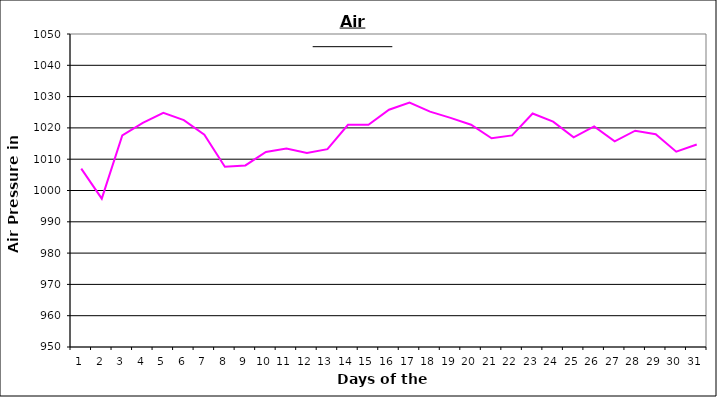
| Category | Series 0 |
|---|---|
| 0 | 1007 |
| 1 | 997.4 |
| 2 | 1017.6 |
| 3 | 1021.6 |
| 4 | 1024.8 |
| 5 | 1022.5 |
| 6 | 1017.8 |
| 7 | 1007.6 |
| 8 | 1008 |
| 9 | 1012.3 |
| 10 | 1013.4 |
| 11 | 1012 |
| 12 | 1013.2 |
| 13 | 1021 |
| 14 | 1021 |
| 15 | 1025.8 |
| 16 | 1028.1 |
| 17 | 1025.2 |
| 18 | 1023.2 |
| 19 | 1021 |
| 20 | 1016.7 |
| 21 | 1017.6 |
| 22 | 1024.6 |
| 23 | 1022 |
| 24 | 1017 |
| 25 | 1020.5 |
| 26 | 1015.7 |
| 27 | 1019.1 |
| 28 | 1018 |
| 29 | 1012.4 |
| 30 | 1014.7 |